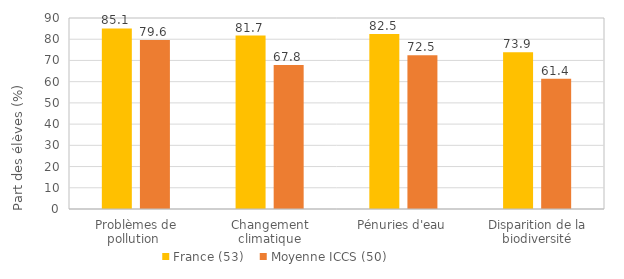
| Category | France (53) | Moyenne ICCS (50) |
|---|---|---|
| Problèmes de pollution  | 85.1 | 79.6 |
| Changement climatique | 81.7 | 67.8 |
| Pénuries d'eau | 82.5 | 72.5 |
| Disparition de la biodiversité | 73.9 | 61.4 |